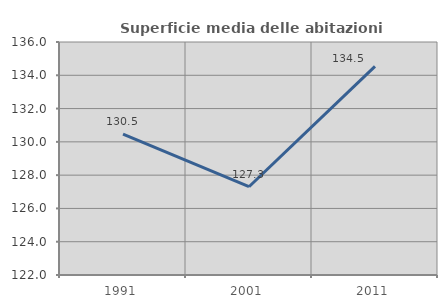
| Category | Superficie media delle abitazioni occupate |
|---|---|
| 1991.0 | 130.469 |
| 2001.0 | 127.303 |
| 2011.0 | 134.537 |